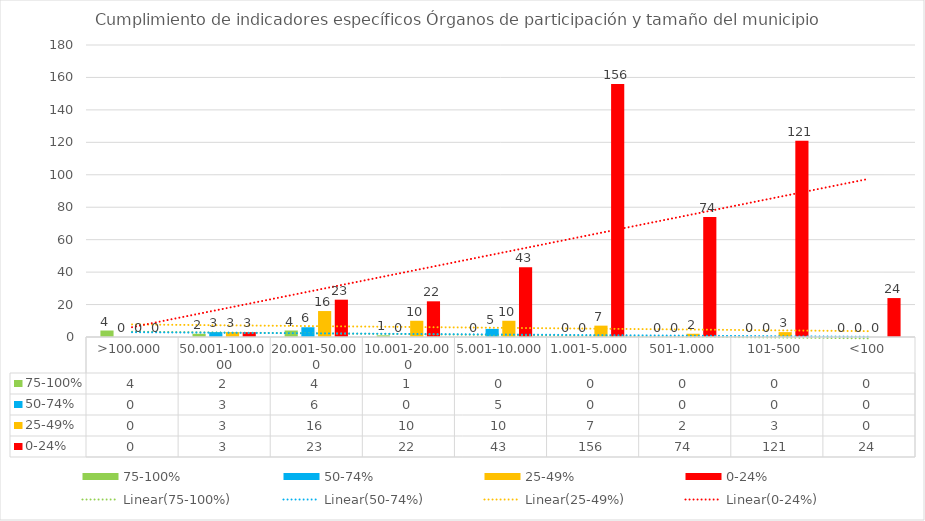
| Category | 75-100% | 50-74% | 25-49% | 0-24% |
|---|---|---|---|---|
| >100.000 | 4 | 0 | 0 | 0 |
| 50.001-100.000 | 2 | 3 | 3 | 3 |
| 20.001-50.000 | 4 | 6 | 16 | 23 |
| 10.001-20.000 | 1 | 0 | 10 | 22 |
| 5.001-10.000 | 0 | 5 | 10 | 43 |
| 1.001-5.000 | 0 | 0 | 7 | 156 |
| 501-1.000 | 0 | 0 | 2 | 74 |
| 101-500 | 0 | 0 | 3 | 121 |
| <100 | 0 | 0 | 0 | 24 |